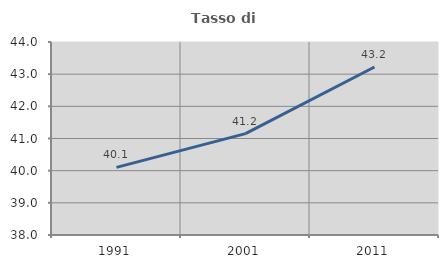
| Category | Tasso di occupazione   |
|---|---|
| 1991.0 | 40.102 |
| 2001.0 | 41.152 |
| 2011.0 | 43.223 |